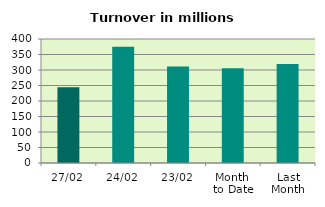
| Category | Series 0 |
|---|---|
| 27/02 | 244.682 |
| 24/02 | 374.767 |
| 23/02 | 311.304 |
| Month 
to Date | 305.474 |
| Last
Month | 318.977 |